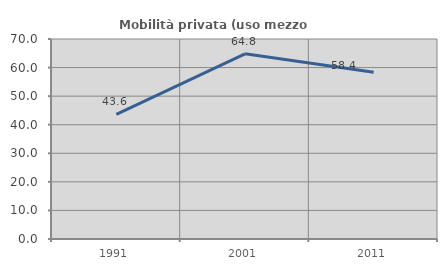
| Category | Mobilità privata (uso mezzo privato) |
|---|---|
| 1991.0 | 43.609 |
| 2001.0 | 64.823 |
| 2011.0 | 58.367 |